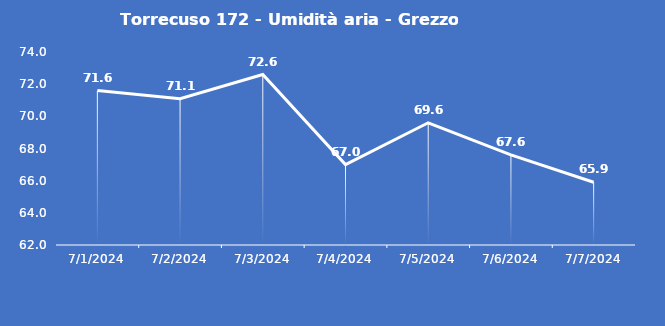
| Category | Torrecuso 172 - Umidità aria - Grezzo (%) |
|---|---|
| 7/1/24 | 71.6 |
| 7/2/24 | 71.1 |
| 7/3/24 | 72.6 |
| 7/4/24 | 67 |
| 7/5/24 | 69.6 |
| 7/6/24 | 67.6 |
| 7/7/24 | 65.9 |